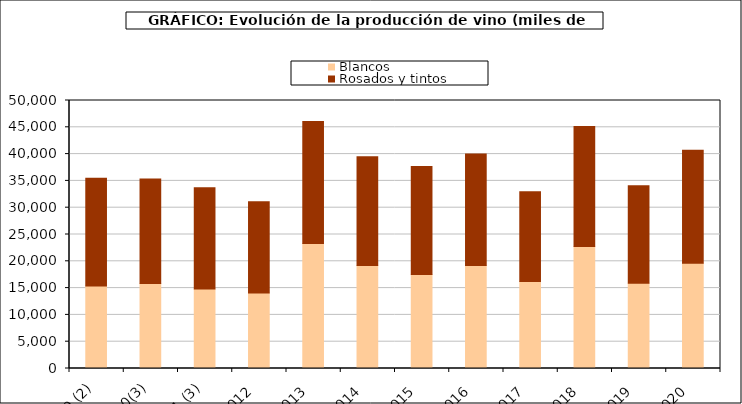
| Category | Blancos | Rosados y tintos |
|---|---|---|
| 2009 (2) | 15387.014 | 20102.28 |
| 2010(3) | 15875.53 | 19477.944 |
| 2011 (3) | 14820.108 | 18889.015 |
| 2012  | 14069.736 | 17052.824 |
| 2013  | 23343.372 | 22735.173 |
| 2014  | 19206.264 | 20287.417 |
| 2015  | 17539.622 | 20162.903 |
| 2016  | 19213.073 | 20826.807 |
| 2017  | 16231.668 | 16738.51 |
| 2018  | 22765.55 | 22400.122 |
| 2019  | 15912.993 | 18167.776 |
| 2020  | 19646.719 | 21081.27 |